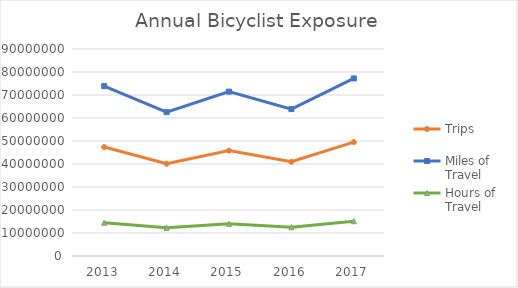
| Category | Trips | Miles of Travel | Hours of Travel |
|---|---|---|---|
| 2013 | 47363487.426 | 73856012.063 | 14477636.092 |
| 2014 | 40106941.19 | 62540553.775 | 12259521.645 |
| 2015 | 45823784.98 | 71455084.923 | 14006993.981 |
| 2016 | 40957121.394 | 63866277.932 | 12519396.927 |
| 2017 | 49508058.335 | 77200137.75 | 15133168.842 |